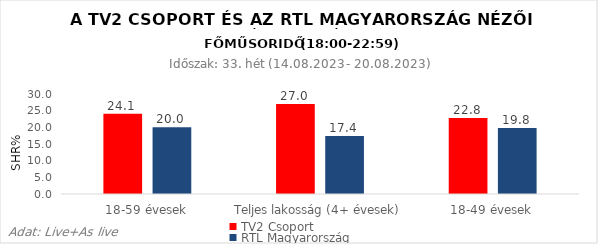
| Category | TV2 Csoport | RTL Magyarország |
|---|---|---|
| 18-59 évesek | 24.1 | 20 |
| Teljes lakosság (4+ évesek) | 27 | 17.4 |
| 18-49 évesek | 22.8 | 19.8 |